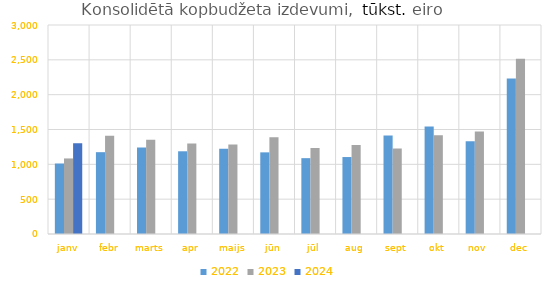
| Category | 2022 | 2023 | 2024 |
|---|---|---|---|
| janv | 1011780.956 | 1084456.317 | 1303627.651 |
| febr | 1174583.857 | 1410804.255 | 0 |
| marts | 1242068.533 | 1353313.614 | 0 |
| apr | 1187341.457 | 1300627.878 | 0 |
| maijs | 1224137.323 | 1285511.298 | 0 |
| jūn | 1172050.575 | 1387062.669 | 0 |
| jūl | 1088648.602 | 1233758.467 | 0 |
| aug | 1104689.423 | 1277311.998 | 0 |
| sept | 1413387.204 | 1228203.988 | 0 |
| okt | 1543583.073 | 1416444.394 | 0 |
| nov | 1331354.715 | 1471104.645 | 0 |
| dec | 2230910.603 | 2516060.844 | 0 |